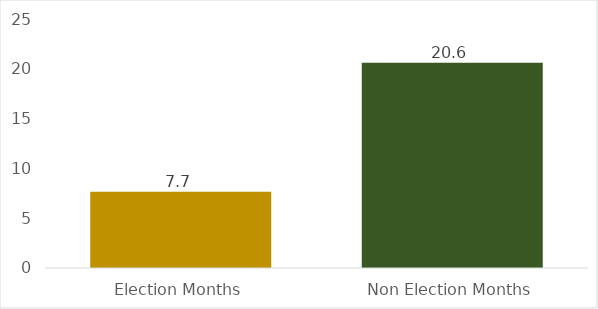
| Category | Average Monthly Payments |
|---|---|
| Election Months | 7.651 |
| Non Election Months | 20.618 |